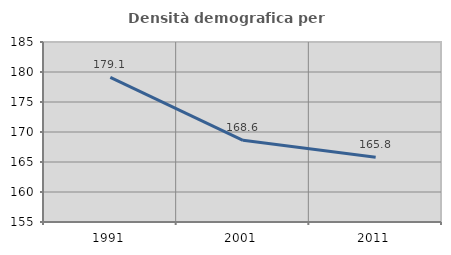
| Category | Densità demografica |
|---|---|
| 1991.0 | 179.109 |
| 2001.0 | 168.614 |
| 2011.0 | 165.782 |